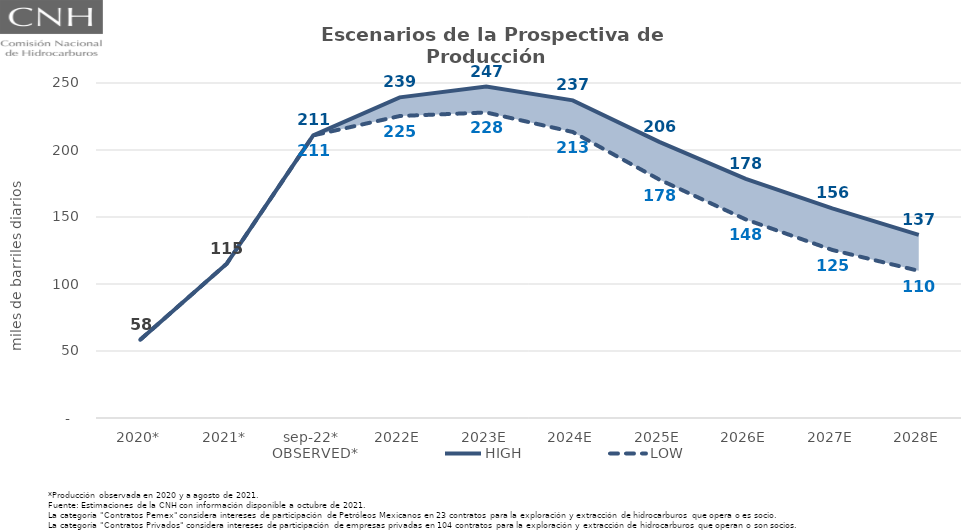
| Category | OBSERVED* | HIGH | LOW |
|---|---|---|---|
| 2020* | 58.421 | 58.421 | 58.421 |
| 2021* | 115.166 | 115.166 | 115.166 |
| sep-22* | 210.883 | 210.883 | 210.883 |
| 2022E | 230.623 | 239.262 | 225.356 |
| 2023E | 233.737 | 247.348 | 227.997 |
| 2024E | 220.901 | 237.025 | 213.428 |
| 2025E | 189.089 | 206.055 | 177.962 |
| 2026E | 161.79 | 178.45 | 148.19 |
| 2027E | 140.11 | 156.399 | 125.412 |
| 2028E | 125.321 | 136.607 | 109.839 |